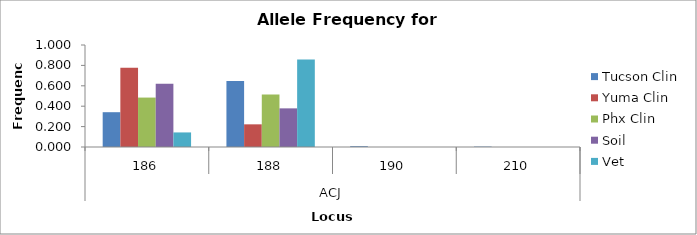
| Category | Tucson Clin | Yuma Clin | Phx Clin | Soil | Vet |
|---|---|---|---|---|---|
| 0 | 0.341 | 0.778 | 0.485 | 0.621 | 0.143 |
| 1 | 0.647 | 0.222 | 0.515 | 0.379 | 0.857 |
| 2 | 0.008 | 0 | 0 | 0 | 0 |
| 3 | 0.004 | 0 | 0 | 0 | 0 |